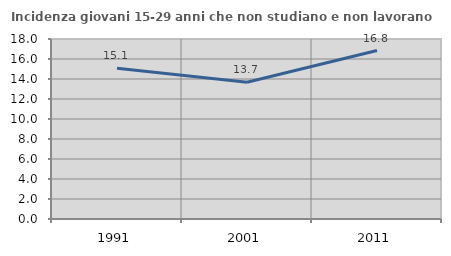
| Category | Incidenza giovani 15-29 anni che non studiano e non lavorano  |
|---|---|
| 1991.0 | 15.074 |
| 2001.0 | 13.678 |
| 2011.0 | 16.846 |